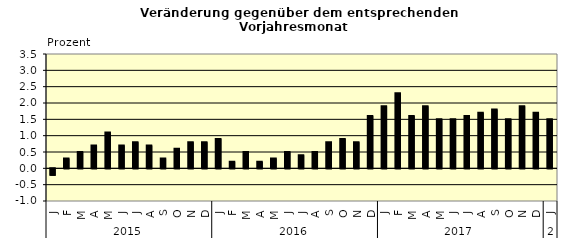
| Category | Series 0 |
|---|---|
| 0 | -0.2 |
| 1 | 0.3 |
| 2 | 0.5 |
| 3 | 0.7 |
| 4 | 1.1 |
| 5 | 0.7 |
| 6 | 0.8 |
| 7 | 0.7 |
| 8 | 0.3 |
| 9 | 0.6 |
| 10 | 0.8 |
| 11 | 0.8 |
| 12 | 0.9 |
| 13 | 0.2 |
| 14 | 0.5 |
| 15 | 0.2 |
| 16 | 0.3 |
| 17 | 0.5 |
| 18 | 0.4 |
| 19 | 0.5 |
| 20 | 0.8 |
| 21 | 0.9 |
| 22 | 0.8 |
| 23 | 1.6 |
| 24 | 1.9 |
| 25 | 2.3 |
| 26 | 1.6 |
| 27 | 1.9 |
| 28 | 1.5 |
| 29 | 1.5 |
| 30 | 1.6 |
| 31 | 1.7 |
| 32 | 1.8 |
| 33 | 1.5 |
| 34 | 1.9 |
| 35 | 1.7 |
| 36 | 1.5 |